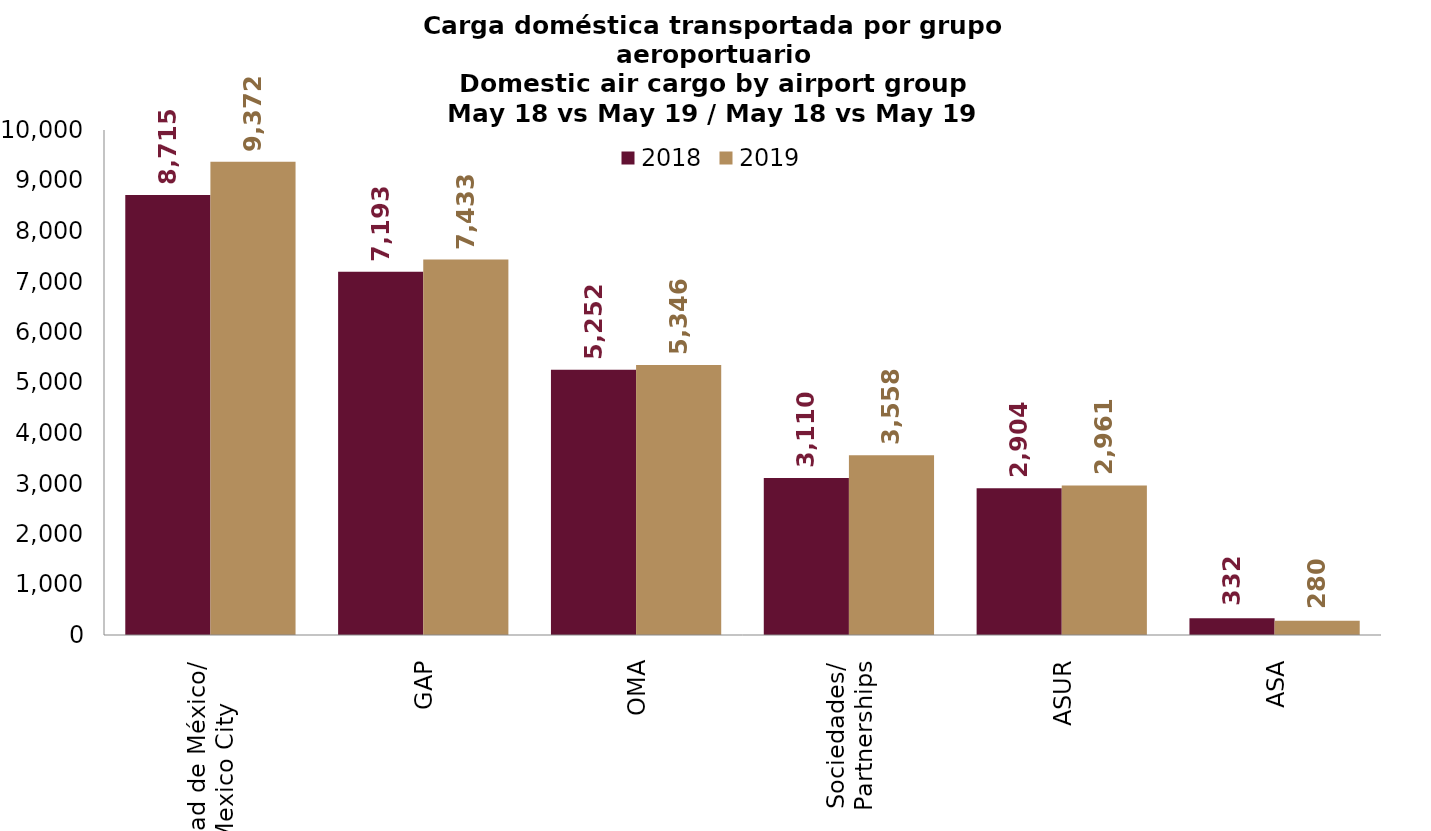
| Category | 2018 | 2019 |
|---|---|---|
| Ciudad de México/
Mexico City | 8715.01 | 9371.84 |
| GAP | 7193.417 | 7433.211 |
| OMA | 5251.819 | 5345.927 |
| Sociedades/
Partnerships | 3110.407 | 3558.05 |
| ASUR | 2904.085 | 2961.048 |
| ASA | 331.838 | 279.969 |